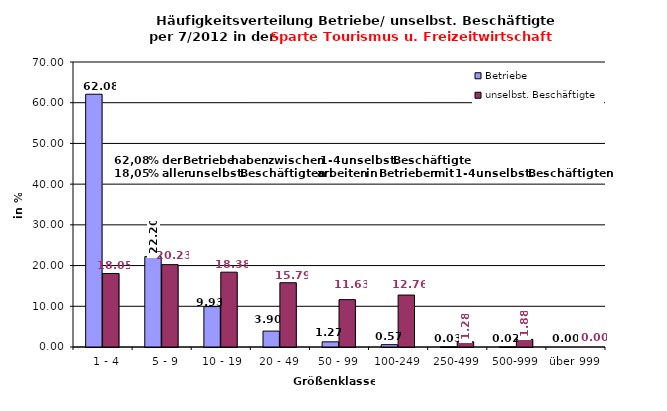
| Category | Betriebe | unselbst. Beschäftigte |
|---|---|---|
|   1 - 4 | 62.079 | 18.05 |
|   5 - 9 | 22.197 | 20.229 |
|  10 - 19 | 9.927 | 18.376 |
| 20 - 49 | 3.905 | 15.787 |
| 50 - 99 | 1.267 | 11.63 |
| 100-249 | 0.573 | 12.76 |
| 250-499 | 0.035 | 1.285 |
| 500-999 | 0.017 | 1.883 |
| über 999 | 0 | 0 |